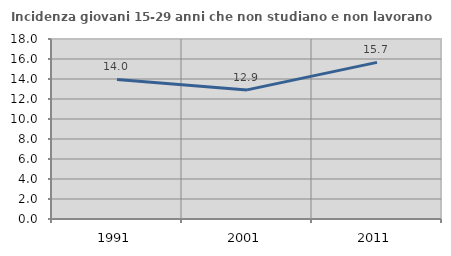
| Category | Incidenza giovani 15-29 anni che non studiano e non lavorano  |
|---|---|
| 1991.0 | 13.953 |
| 2001.0 | 12.91 |
| 2011.0 | 15.665 |